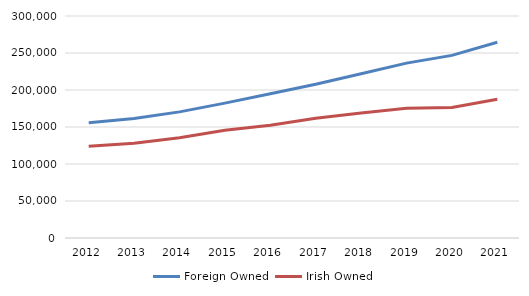
| Category | Foreign Owned | Irish Owned |
|---|---|---|
| 2012.0 | 155863 | 124135 |
| 2013.0 | 161471 | 128114 |
| 2014.0 | 170452 | 135505 |
| 2015.0 | 182242 | 145696 |
| 2016.0 | 195053 | 152347 |
| 2017.0 | 207748 | 161719 |
| 2018.0 | 221896 | 168793 |
| 2019.0 | 236305 | 175228 |
| 2020.0 | 246786 | 176250 |
| 2021.0 | 264464 | 187481 |